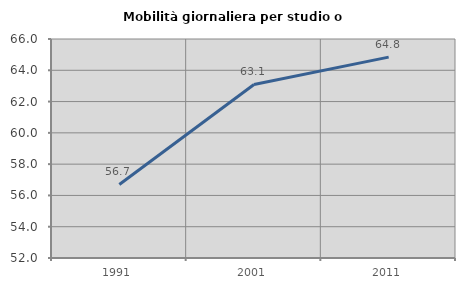
| Category | Mobilità giornaliera per studio o lavoro |
|---|---|
| 1991.0 | 56.701 |
| 2001.0 | 63.096 |
| 2011.0 | 64.841 |